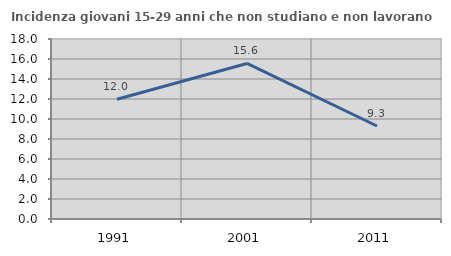
| Category | Incidenza giovani 15-29 anni che non studiano e non lavorano  |
|---|---|
| 1991.0 | 11.979 |
| 2001.0 | 15.556 |
| 2011.0 | 9.302 |